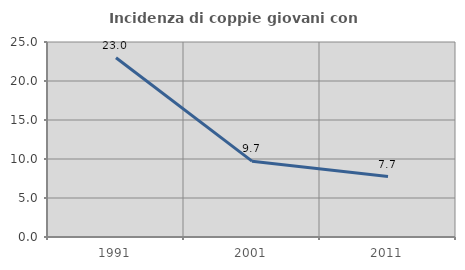
| Category | Incidenza di coppie giovani con figli |
|---|---|
| 1991.0 | 22.973 |
| 2001.0 | 9.722 |
| 2011.0 | 7.742 |